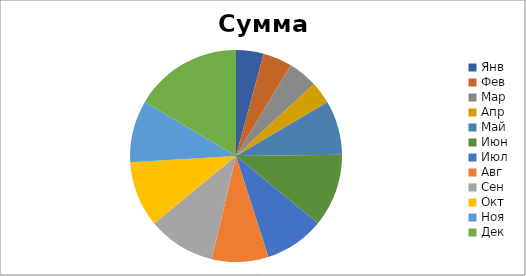
| Category | Сумма сделок |
|---|---|
| Янв | 7092 |
| Фев | 7497 |
| Мар | 7560 |
| Апр | 5796 |
| Май | 13984 |
| Июн | 18743 |
| Июл | 15434 |
| Авг | 14545 |
| Сен | 17434 |
| Окт | 16984 |
| Ноя | 15983 |
| Дек | 27822 |